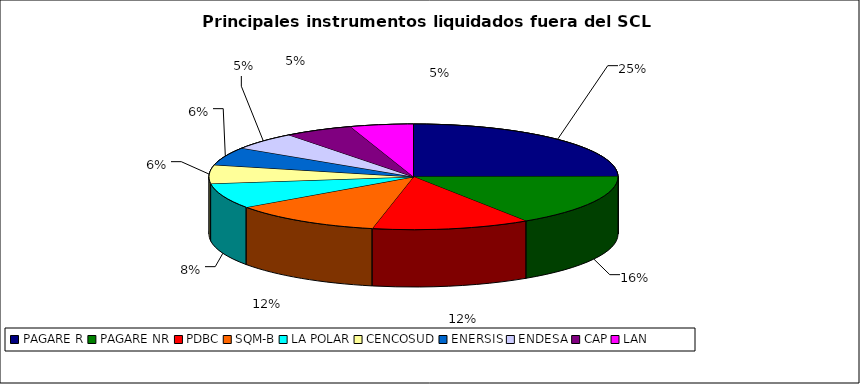
| Category | Series 0 |
|---|---|
| PAGARE R | 1907 |
| PAGARE NR | 1216 |
| PDBC | 957 |
| SQM-B | 920 |
| LA POLAR | 592 |
| CENCOSUD | 435 |
| ENERSIS | 423 |
| ENDESA | 416 |
| CAP | 415 |
| LAN | 383 |